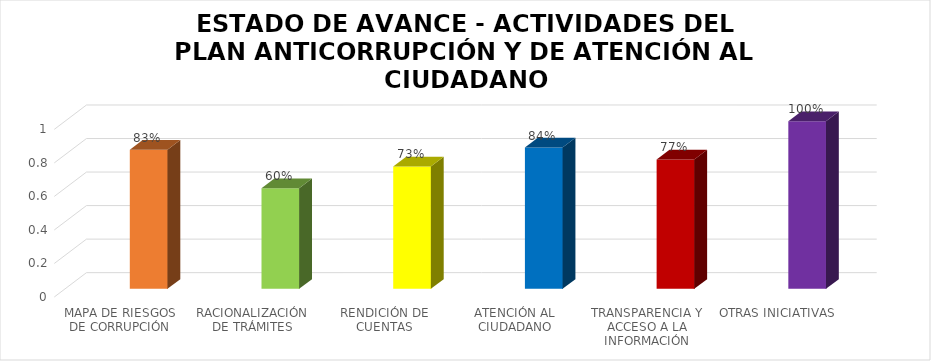
| Category | Series 0 | % AVANCE |
|---|---|---|
| MAPA DE RIESGOS DE CORRUPCIÓN |  | 0.83 |
| RACIONALIZACIÓN DE TRÁMITES |  | 0.6 |
| RENDICIÓN DE CUENTAS |  | 0.73 |
| ATENCIÓN AL CIUDADANO |  | 0.843 |
| TRANSPARENCIA Y ACCESO A LA INFORMACIÓN |  | 0.772 |
| OTRAS INICIATIVAS |  | 1 |